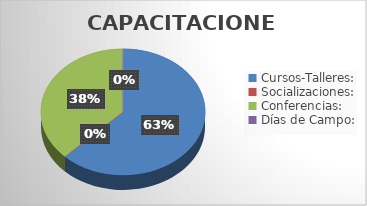
| Category | Series 0 |
|---|---|
| Cursos-Talleres: | 5 |
| Socializaciones: | 0 |
| Conferencias: | 3 |
| Días de Campo: | 0 |